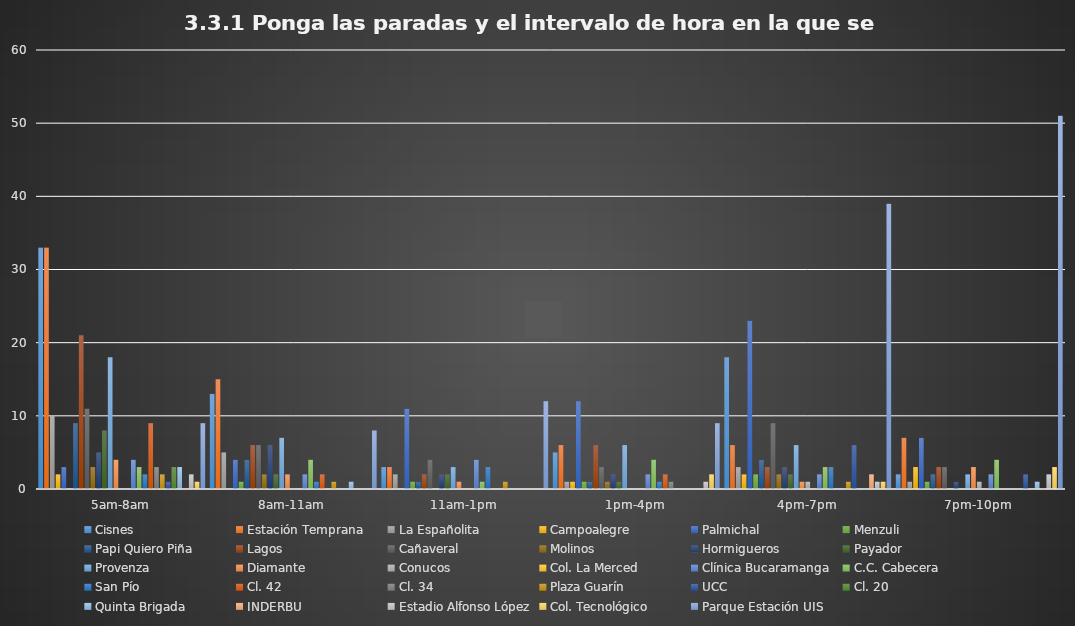
| Category | Cisnes | Estación Temprana | La Españolita | Campoalegre | Palmichal | Menzuli | Papi Quiero Piña | Lagos | Cañaveral | Molinos | Hormigueros | Payador | Provenza | Diamante | Conucos | Col. La Merced | Clínica Bucaramanga | C.C. Cabecera | San Pío | Cl. 42 | Cl. 34 | Plaza Guarín | UCC | Cl. 20 | Quinta Brigada | INDERBU | Estadio Alfonso López | Col. Tecnológico | Parque Estación UIS |
|---|---|---|---|---|---|---|---|---|---|---|---|---|---|---|---|---|---|---|---|---|---|---|---|---|---|---|---|---|---|
| 5am-8am | 33 | 33 | 10 | 2 | 3 | 0 | 9 | 21 | 11 | 3 | 5 | 8 | 18 | 4 | 0 | 0 | 4 | 3 | 2 | 9 | 3 | 2 | 1 | 3 | 3 | 0 | 2 | 1 | 9 |
| 8am-11am | 13 | 15 | 5 | 0 | 4 | 1 | 4 | 6 | 6 | 2 | 6 | 2 | 7 | 2 | 0 | 0 | 2 | 4 | 1 | 2 | 0 | 1 | 0 | 0 | 1 | 0 | 0 | 0 | 8 |
| 11am-1pm | 3 | 3 | 2 | 0 | 11 | 1 | 1 | 2 | 4 | 0 | 2 | 2 | 3 | 1 | 0 | 0 | 4 | 1 | 3 | 0 | 0 | 1 | 0 | 0 | 0 | 0 | 0 | 0 | 12 |
| 1pm-4pm | 5 | 6 | 1 | 1 | 12 | 1 | 1 | 6 | 3 | 1 | 2 | 1 | 6 | 0 | 0 | 0 | 2 | 4 | 1 | 2 | 1 | 0 | 0 | 0 | 0 | 0 | 1 | 2 | 9 |
| 4pm-7pm | 18 | 6 | 3 | 2 | 23 | 2 | 4 | 3 | 9 | 2 | 3 | 2 | 6 | 1 | 1 | 0 | 2 | 3 | 3 | 0 | 0 | 1 | 6 | 0 | 0 | 2 | 1 | 1 | 39 |
| 7pm-10pm | 2 | 7 | 1 | 3 | 7 | 1 | 2 | 3 | 3 | 0 | 1 | 0 | 2 | 3 | 1 | 0 | 2 | 4 | 0 | 0 | 0 | 0 | 2 | 0 | 1 | 0 | 2 | 3 | 51 |